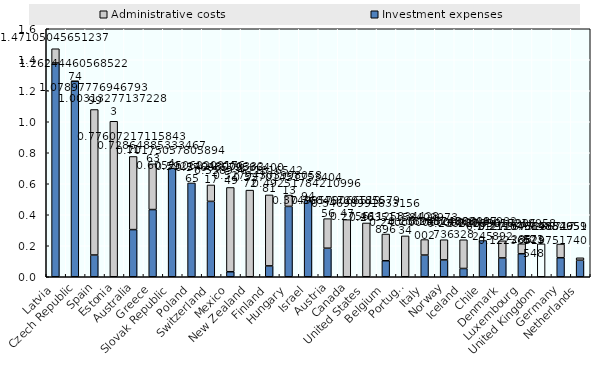
| Category | Investment expenses | Administrative costs |
|---|---|---|
| Latvia | 1.379 | 0.092 |
| Czech Republic | 1.261 | 0.001 |
| Spain | 0.14 | 0.939 |
| Estonia | 0 | 1.003 |
| Australia | 0.304 | 0.472 |
| Greece | 0.434 | 0.295 |
| Slovak Republic | 0.702 | 0 |
| Poland | 0.605 | 0 |
| Switzerland | 0.486 | 0.106 |
| Mexico | 0.032 | 0.544 |
| New Zealand | 0 | 0.559 |
| Finland | 0.07 | 0.458 |
| Hungary | 0.454 | 0.073 |
| Israel | 0.493 | 0 |
| Austria | 0.184 | 0.191 |
| Canada | 0 | 0.368 |
| United States | 0 | 0.347 |
| Belgium | 0.103 | 0.172 |
| Portugal | 0 | 0.264 |
| Italy | 0.14 | 0.1 |
| Norway | 0.109 | 0.13 |
| Iceland | 0.053 | 0.185 |
| Chile | 0.234 | 0 |
| Denmark | 0.122 | 0.11 |
| Luxembourg | 0.149 | 0.064 |
| United Kingdom | 0.212 | 0 |
| Germany | 0.123 | 0.088 |
| Netherlands | 0.107 | 0.016 |